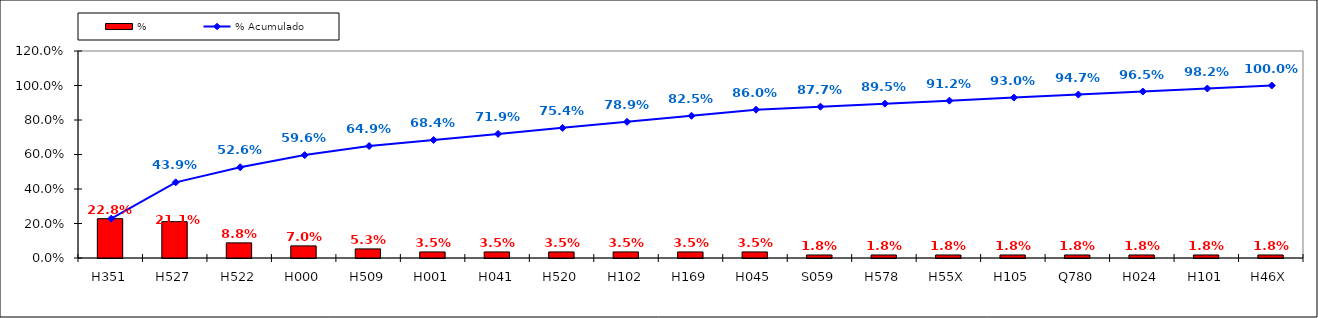
| Category | % |
|---|---|
| H351 | 0.228 |
| H527 | 0.211 |
| H522 | 0.088 |
| H000 | 0.07 |
| H509 | 0.053 |
| H001 | 0.035 |
| H041 | 0.035 |
| H520 | 0.035 |
| H102 | 0.035 |
| H169 | 0.035 |
| H045 | 0.035 |
| S059 | 0.018 |
| H578 | 0.018 |
| H55X | 0.018 |
| H105 | 0.018 |
| Q780 | 0.018 |
| H024 | 0.018 |
| H101 | 0.018 |
| H46X | 0.018 |